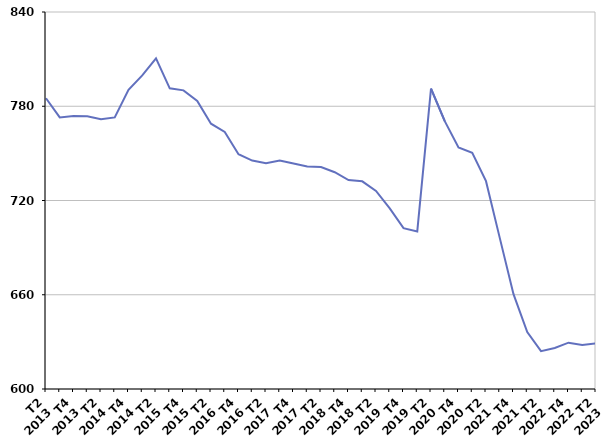
| Category | Moins de 25 ans |
|---|---|
| T2
2013 | 785.1 |
| T3
2013 | 772.9 |
| T4
2013 | 773.8 |
| T1
2014 | 773.6 |
| T2
2014 | 771.7 |
| T3
2014 | 772.9 |
| T4
2014 | 790.4 |
| T1
2015 | 799.6 |
| T2
2015 | 810.5 |
| T3
2015 | 791.4 |
| T4
2015 | 790.1 |
| T1
2016 | 783.4 |
| T2
2016 | 768.9 |
| T3
2016 | 763.6 |
| T4
2016 | 749.5 |
| T1
2017 | 745.4 |
| T2
2017 | 743.7 |
| T3
2017 | 745.5 |
| T4
2017 | 743.5 |
| T1
2018 | 741.6 |
| T2
2018 | 741.3 |
| T3
2018 | 738 |
| T4
2018 | 733 |
| T1
2019 | 732.2 |
| T2
2019 | 726.1 |
| T3
2019 | 715 |
| T4
2019 | 702.4 |
| T1
2020 | 700.3 |
| T2
2020 | 791.2 |
| T3
2020 | 770.5 |
| T4
2020 | 753.8 |
| T1
2021 | 750.3 |
| T2
2021 | 732.3 |
| T3
2021 | 696.2 |
| T4
2021 | 660.4 |
| T1
2022 | 636.3 |
| T2
2022 | 624.1 |
| T3
2022 | 626.1 |
| T4
2022 | 629.5 |
| T1
2023 | 628 |
| T2
2023 | 629.1 |